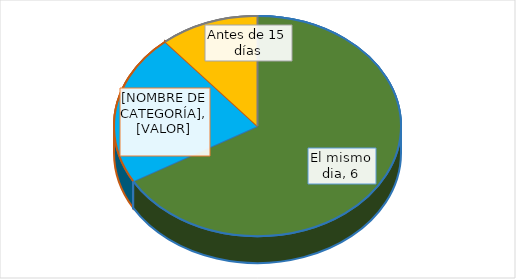
| Category | Series 0 |
|---|---|
| El mismo dia | 6 |
| Antes de 10 días | 2 |
| Antes de 15 días | 1 |